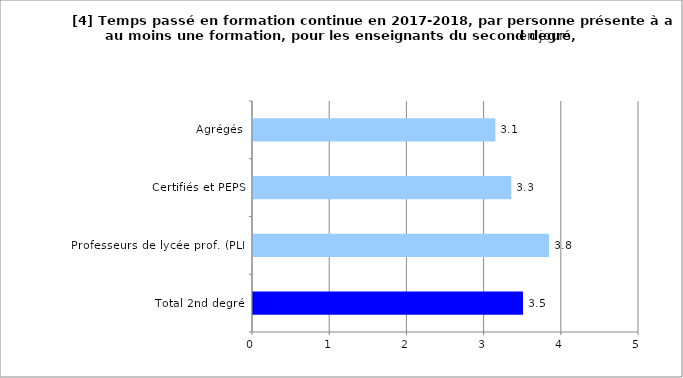
| Category | Series 0 |
|---|---|
| Total 2nd degré | 3.497 |
| Professeurs de lycée prof. (PLP) | 3.834 |
| Certifiés et PEPS | 3.345 |
| Agrégés | 3.139 |